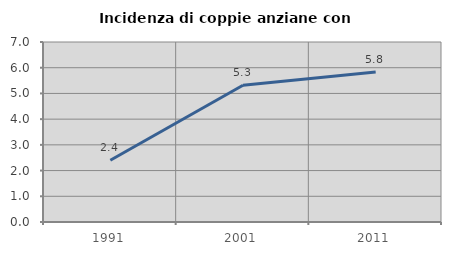
| Category | Incidenza di coppie anziane con figli |
|---|---|
| 1991.0 | 2.402 |
| 2001.0 | 5.319 |
| 2011.0 | 5.836 |